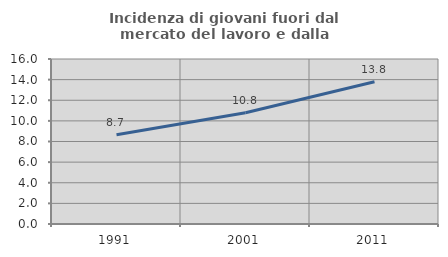
| Category | Incidenza di giovani fuori dal mercato del lavoro e dalla formazione  |
|---|---|
| 1991.0 | 8.654 |
| 2001.0 | 10.784 |
| 2011.0 | 13.793 |